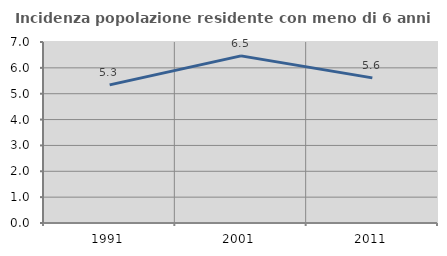
| Category | Incidenza popolazione residente con meno di 6 anni |
|---|---|
| 1991.0 | 5.341 |
| 2001.0 | 6.463 |
| 2011.0 | 5.612 |